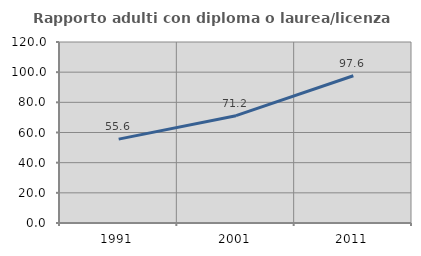
| Category | Rapporto adulti con diploma o laurea/licenza media  |
|---|---|
| 1991.0 | 55.625 |
| 2001.0 | 71.163 |
| 2011.0 | 97.619 |